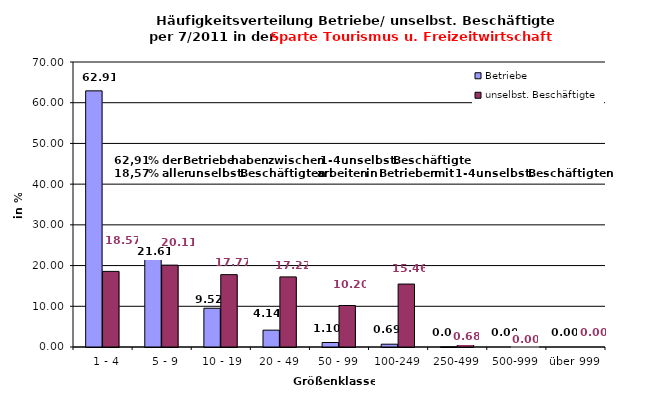
| Category | Betriebe | unselbst. Beschäftigte |
|---|---|---|
|   1 - 4 | 62.912 | 18.567 |
|   5 - 9 | 21.615 | 20.106 |
|  10 - 19 | 9.522 | 17.774 |
| 20 - 49 | 4.14 | 17.221 |
| 50 - 99 | 1.104 | 10.196 |
| 100-249 | 0.69 | 15.459 |
| 250-499 | 0.017 | 0.677 |
| 500-999 | 0 | 0 |
| über 999 | 0 | 0 |